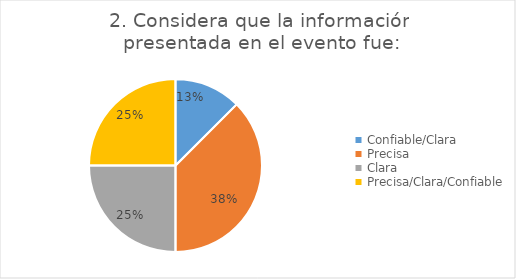
| Category | Series 0 |
|---|---|
| Confiable/Clara | 1 |
| Precisa | 3 |
| Clara | 2 |
| Precisa/Clara/Confiable | 2 |